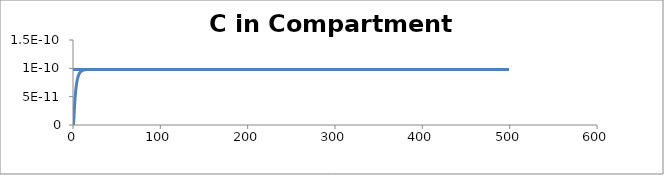
| Category | C - Sys 3 |
|---|---|
| 0.5 | 0 |
| 1.0 | 0 |
| 1.5 | 0 |
| 2.0 | 0 |
| 2.5 | 0 |
| 3.0 | 0 |
| 3.5 | 0 |
| 4.0 | 0 |
| 4.500000000000001 | 0 |
| 5.0 | 0 |
| 5.5 | 0 |
| 6.0 | 0 |
| 6.500000000000001 | 0 |
| 7.0 | 0 |
| 7.5 | 0 |
| 8.0 | 0 |
| 8.5 | 0 |
| 9.000000000000002 | 0 |
| 9.5 | 0 |
| 10.0 | 0 |
| 10.5 | 0 |
| 11.0 | 0 |
| 11.5 | 0 |
| 12.0 | 0 |
| 12.5 | 0 |
| 13.000000000000002 | 0 |
| 13.5 | 0 |
| 14.0 | 0 |
| 14.5 | 0 |
| 15.0 | 0 |
| 15.5 | 0 |
| 16.0 | 0 |
| 16.5 | 0 |
| 17.0 | 0 |
| 17.5 | 0 |
| 18.000000000000004 | 0 |
| 18.5 | 0 |
| 19.0 | 0 |
| 19.5 | 0 |
| 20.0 | 0 |
| 20.5 | 0 |
| 21.0 | 0 |
| 21.5 | 0 |
| 22.0 | 0 |
| 22.5 | 0 |
| 23.0 | 0 |
| 23.5 | 0 |
| 24.0 | 0 |
| 24.5 | 0 |
| 25.0 | 0 |
| 25.500000000000004 | 0 |
| 26.000000000000004 | 0 |
| 26.5 | 0 |
| 27.0 | 0 |
| 27.5 | 0 |
| 28.0 | 0 |
| 28.5 | 0 |
| 29.0 | 0 |
| 29.500000000000004 | 0 |
| 30.0 | 0 |
| 30.5 | 0 |
| 31.0 | 0 |
| 31.5 | 0 |
| 32.0 | 0 |
| 32.5 | 0 |
| 33.0 | 0 |
| 33.5 | 0 |
| 34.0 | 0 |
| 34.5 | 0 |
| 35.0 | 0 |
| 35.50000000000001 | 0 |
| 36.00000000000001 | 0 |
| 36.5 | 0 |
| 37.0 | 0 |
| 37.5 | 0 |
| 38.0 | 0 |
| 38.5 | 0 |
| 39.0 | 0 |
| 39.5 | 0 |
| 40.0 | 0 |
| 40.5 | 0 |
| 41.0 | 0 |
| 41.5 | 0 |
| 42.0 | 0 |
| 42.5 | 0 |
| 43.0 | 0 |
| 43.50000000000001 | 0 |
| 44.0 | 0 |
| 44.5 | 0 |
| 45.0 | 0 |
| 45.5 | 0 |
| 46.0 | 0 |
| 46.5 | 0 |
| 47.0 | 0 |
| 47.5 | 0 |
| 48.0 | 0 |
| 48.5 | 0 |
| 49.0 | 0 |
| 49.5 | 0 |
| 50.0 | 0 |
| 50.5 | 0 |
| 51.00000000000001 | 0 |
| 51.50000000000001 | 0 |
| 52.00000000000001 | 0 |
| 52.5 | 0 |
| 53.0 | 0 |
| 53.5 | 0 |
| 54.0 | 0 |
| 54.5 | 0 |
| 55.0 | 0 |
| 55.5 | 0 |
| 56.0 | 0 |
| 56.5 | 0 |
| 57.0 | 0 |
| 57.5 | 0 |
| 58.0 | 0 |
| 58.5 | 0 |
| 59.00000000000001 | 0 |
| 59.50000000000001 | 0 |
| 60.0 | 0 |
| 60.5 | 0 |
| 61.0 | 0 |
| 61.5 | 0 |
| 62.0 | 0 |
| 62.5 | 0 |
| 63.0 | 0 |
| 63.5 | 0 |
| 64.0 | 0 |
| 64.5 | 0 |
| 65.0 | 0 |
| 65.5 | 0 |
| 66.0 | 0 |
| 66.5 | 0 |
| 67.0 | 0 |
| 67.5 | 0 |
| 68.0 | 0 |
| 68.5 | 0 |
| 69.0 | 0 |
| 69.5 | 0 |
| 70.0 | 0 |
| 70.5 | 0 |
| 71.00000000000001 | 0 |
| 71.50000000000001 | 0 |
| 72.00000000000001 | 0 |
| 72.5 | 0 |
| 73.0 | 0 |
| 73.5 | 0 |
| 74.0 | 0 |
| 74.5 | 0 |
| 75.0 | 0 |
| 75.5 | 0 |
| 76.0 | 0 |
| 76.5 | 0 |
| 77.0 | 0 |
| 77.5 | 0 |
| 78.0 | 0 |
| 78.5 | 0 |
| 79.0 | 0 |
| 79.5 | 0 |
| 80.0 | 0 |
| 80.5 | 0 |
| 81.0 | 0 |
| 81.5 | 0 |
| 82.0 | 0 |
| 82.5 | 0 |
| 83.0 | 0 |
| 83.5 | 0 |
| 84.0 | 0 |
| 84.5 | 0 |
| 85.0 | 0 |
| 85.5 | 0 |
| 86.0 | 0 |
| 86.50000000000001 | 0 |
| 87.00000000000001 | 0 |
| 87.50000000000001 | 0 |
| 88.0 | 0 |
| 88.5 | 0 |
| 89.0 | 0 |
| 89.5 | 0 |
| 90.0 | 0 |
| 90.5 | 0 |
| 91.0 | 0 |
| 91.5 | 0 |
| 92.0 | 0 |
| 92.5 | 0 |
| 93.0 | 0 |
| 93.5 | 0 |
| 94.0 | 0 |
| 94.5 | 0 |
| 95.0 | 0 |
| 95.5 | 0 |
| 96.0 | 0 |
| 96.5 | 0 |
| 97.0 | 0 |
| 97.5 | 0 |
| 98.0 | 0 |
| 98.5 | 0 |
| 99.0 | 0 |
| 99.5 | 0 |
| 100.0 | 0 |
| 100.5 | 0 |
| 101.0 | 0 |
| 101.5 | 0 |
| 102.00000000000001 | 0 |
| 102.50000000000001 | 0 |
| 103.00000000000001 | 0 |
| 103.50000000000001 | 0 |
| 104.00000000000001 | 0 |
| 104.5 | 0 |
| 105.0 | 0 |
| 105.5 | 0 |
| 106.0 | 0 |
| 106.5 | 0 |
| 107.0 | 0 |
| 107.5 | 0 |
| 108.0 | 0 |
| 108.5 | 0 |
| 109.0 | 0 |
| 109.5 | 0 |
| 110.0 | 0 |
| 110.5 | 0 |
| 111.0 | 0 |
| 111.5 | 0 |
| 112.0 | 0 |
| 112.5 | 0 |
| 113.0 | 0 |
| 113.5 | 0 |
| 114.0 | 0 |
| 114.5 | 0 |
| 115.0 | 0 |
| 115.5 | 0 |
| 116.0 | 0 |
| 116.5 | 0 |
| 117.0 | 0 |
| 117.50000000000001 | 0 |
| 118.00000000000001 | 0 |
| 118.50000000000001 | 0 |
| 119.00000000000001 | 0 |
| 119.50000000000001 | 0 |
| 120.0 | 0 |
| 120.5 | 0 |
| 121.0 | 0 |
| 121.5 | 0 |
| 122.0 | 0 |
| 122.5 | 0 |
| 123.0 | 0 |
| 123.5 | 0 |
| 124.0 | 0 |
| 124.5 | 0 |
| 125.0 | 0 |
| 125.5 | 0 |
| 126.0 | 0 |
| 126.5 | 0 |
| 127.0 | 0 |
| 127.5 | 0 |
| 128.0 | 0 |
| 128.5 | 0 |
| 129.0 | 0 |
| 129.5 | 0 |
| 130.0 | 0 |
| 130.5 | 0 |
| 131.0 | 0 |
| 131.5 | 0 |
| 132.0 | 0 |
| 132.5 | 0 |
| 133.0 | 0 |
| 133.5 | 0 |
| 134.0 | 0 |
| 134.5 | 0 |
| 135.0 | 0 |
| 135.5 | 0 |
| 136.0 | 0 |
| 136.5 | 0 |
| 137.0 | 0 |
| 137.5 | 0 |
| 138.0 | 0 |
| 138.5 | 0 |
| 139.0 | 0 |
| 139.5 | 0 |
| 140.0 | 0 |
| 140.5 | 0 |
| 141.0 | 0 |
| 141.50000000000003 | 0 |
| 142.00000000000003 | 0 |
| 142.50000000000003 | 0 |
| 143.00000000000003 | 0 |
| 143.50000000000003 | 0 |
| 144.00000000000003 | 0 |
| 144.5 | 0 |
| 145.0 | 0 |
| 145.5 | 0 |
| 146.0 | 0 |
| 146.5 | 0 |
| 147.0 | 0 |
| 147.5 | 0 |
| 148.0 | 0 |
| 148.5 | 0 |
| 149.0 | 0 |
| 149.5 | 0 |
| 150.0 | 0 |
| 150.5 | 0 |
| 151.0 | 0 |
| 151.5 | 0 |
| 152.0 | 0 |
| 152.5 | 0 |
| 153.0 | 0 |
| 153.5 | 0 |
| 154.0 | 0 |
| 154.5 | 0 |
| 155.0 | 0 |
| 155.5 | 0 |
| 156.0 | 0 |
| 156.5 | 0 |
| 157.0 | 0 |
| 157.5 | 0 |
| 158.0 | 0 |
| 158.5 | 0 |
| 159.0 | 0 |
| 159.5 | 0 |
| 160.0 | 0 |
| 160.5 | 0 |
| 161.0 | 0 |
| 161.5 | 0 |
| 162.0 | 0 |
| 162.5 | 0 |
| 163.0 | 0 |
| 163.5 | 0 |
| 164.0 | 0 |
| 164.5 | 0 |
| 165.0 | 0 |
| 165.5 | 0 |
| 166.0 | 0 |
| 166.5 | 0 |
| 167.0 | 0 |
| 167.5 | 0 |
| 168.0 | 0 |
| 168.5 | 0 |
| 169.0 | 0 |
| 169.5 | 0 |
| 170.0 | 0 |
| 170.5 | 0 |
| 171.0 | 0 |
| 171.5 | 0 |
| 172.0 | 0 |
| 172.50000000000003 | 0 |
| 173.00000000000003 | 0 |
| 173.50000000000003 | 0 |
| 174.00000000000003 | 0 |
| 174.50000000000003 | 0 |
| 175.00000000000003 | 0 |
| 175.50000000000003 | 0 |
| 176.0 | 0 |
| 176.5 | 0 |
| 177.0 | 0 |
| 177.5 | 0 |
| 178.0 | 0 |
| 178.5 | 0 |
| 179.0 | 0 |
| 179.5 | 0 |
| 180.0 | 0 |
| 180.5 | 0 |
| 181.0 | 0 |
| 181.5 | 0 |
| 182.0 | 0 |
| 182.5 | 0 |
| 183.0 | 0 |
| 183.5 | 0 |
| 184.0 | 0 |
| 184.5 | 0 |
| 185.0 | 0 |
| 185.5 | 0 |
| 186.0 | 0 |
| 186.5 | 0 |
| 187.0 | 0 |
| 187.5 | 0 |
| 188.0 | 0 |
| 188.5 | 0 |
| 189.0 | 0 |
| 189.5 | 0 |
| 190.0 | 0 |
| 190.5 | 0 |
| 191.0 | 0 |
| 191.5 | 0 |
| 192.0 | 0 |
| 192.5 | 0 |
| 193.0 | 0 |
| 193.5 | 0 |
| 194.0 | 0 |
| 194.5 | 0 |
| 195.0 | 0 |
| 195.5 | 0 |
| 196.0 | 0 |
| 196.5 | 0 |
| 197.0 | 0 |
| 197.5 | 0 |
| 198.0 | 0 |
| 198.5 | 0 |
| 199.0 | 0 |
| 199.5 | 0 |
| 200.0 | 0 |
| 200.5 | 0 |
| 201.0 | 0 |
| 201.5 | 0 |
| 202.0 | 0 |
| 202.5 | 0 |
| 203.0 | 0 |
| 203.5 | 0 |
| 204.00000000000003 | 0 |
| 204.50000000000003 | 0 |
| 205.00000000000003 | 0 |
| 205.50000000000003 | 0 |
| 206.00000000000003 | 0 |
| 206.50000000000003 | 0 |
| 207.00000000000003 | 0 |
| 207.50000000000003 | 0 |
| 208.00000000000003 | 0 |
| 208.5 | 0 |
| 209.0 | 0 |
| 209.5 | 0 |
| 210.0 | 0 |
| 210.5 | 0 |
| 211.0 | 0 |
| 211.5 | 0 |
| 212.0 | 0 |
| 212.5 | 0 |
| 213.0 | 0 |
| 213.5 | 0 |
| 214.0 | 0 |
| 214.5 | 0 |
| 215.0 | 0 |
| 215.5 | 0 |
| 216.0 | 0 |
| 216.5 | 0 |
| 217.0 | 0 |
| 217.5 | 0 |
| 218.0 | 0 |
| 218.5 | 0 |
| 219.0 | 0 |
| 219.5 | 0 |
| 220.0 | 0 |
| 220.5 | 0 |
| 221.0 | 0 |
| 221.5 | 0 |
| 222.0 | 0 |
| 222.5 | 0 |
| 223.0 | 0 |
| 223.5 | 0 |
| 224.0 | 0 |
| 224.5 | 0 |
| 225.0 | 0 |
| 225.5 | 0 |
| 226.0 | 0 |
| 226.5 | 0 |
| 227.0 | 0 |
| 227.5 | 0 |
| 228.0 | 0 |
| 228.5 | 0 |
| 229.0 | 0 |
| 229.5 | 0 |
| 230.0 | 0 |
| 230.5 | 0 |
| 231.0 | 0 |
| 231.5 | 0 |
| 232.0 | 0 |
| 232.5 | 0 |
| 233.0 | 0 |
| 233.5 | 0 |
| 234.0 | 0 |
| 234.5 | 0 |
| 235.00000000000003 | 0 |
| 235.50000000000003 | 0 |
| 236.00000000000003 | 0 |
| 236.50000000000003 | 0 |
| 237.00000000000003 | 0 |
| 237.50000000000003 | 0 |
| 238.00000000000003 | 0 |
| 238.50000000000003 | 0 |
| 239.00000000000003 | 0 |
| 239.50000000000003 | 0 |
| 240.0 | 0 |
| 240.5 | 0 |
| 241.0 | 0 |
| 241.5 | 0 |
| 242.0 | 0 |
| 242.5 | 0 |
| 243.0 | 0 |
| 243.5 | 0 |
| 244.0 | 0 |
| 244.5 | 0 |
| 245.0 | 0 |
| 245.5 | 0 |
| 246.0 | 0 |
| 246.5 | 0 |
| 247.0 | 0 |
| 247.5 | 0 |
| 248.0 | 0 |
| 248.5 | 0 |
| 249.0 | 0 |
| 249.5 | 0 |
| 250.0 | 0 |
| 250.5 | 0 |
| 251.0 | 0 |
| 251.5 | 0 |
| 252.0 | 0 |
| 252.5 | 0 |
| 253.0 | 0 |
| 253.5 | 0 |
| 254.0 | 0 |
| 254.5 | 0 |
| 255.0 | 0 |
| 255.5 | 0 |
| 256.0 | 0 |
| 256.5 | 0 |
| 257.0 | 0 |
| 257.5 | 0 |
| 258.0 | 0 |
| 258.5 | 0 |
| 259.0 | 0 |
| 259.5 | 0 |
| 260.0 | 0 |
| 260.5 | 0 |
| 261.0 | 0 |
| 261.5 | 0 |
| 262.0 | 0 |
| 262.5 | 0 |
| 263.0 | 0 |
| 263.5 | 0 |
| 264.0 | 0 |
| 264.5 | 0 |
| 265.0 | 0 |
| 265.5 | 0 |
| 266.0 | 0 |
| 266.5 | 0 |
| 267.0 | 0 |
| 267.5 | 0 |
| 268.0 | 0 |
| 268.5 | 0 |
| 269.0 | 0 |
| 269.5 | 0 |
| 270.0 | 0 |
| 270.5 | 0 |
| 271.0 | 0 |
| 271.5 | 0 |
| 272.0 | 0 |
| 272.5 | 0 |
| 273.0 | 0 |
| 273.5 | 0 |
| 274.0 | 0 |
| 274.5 | 0 |
| 275.0 | 0 |
| 275.5 | 0 |
| 276.0 | 0 |
| 276.5 | 0 |
| 277.0 | 0 |
| 277.5 | 0 |
| 278.0 | 0 |
| 278.5 | 0 |
| 279.0 | 0 |
| 279.5 | 0 |
| 280.0 | 0 |
| 280.5 | 0 |
| 281.0 | 0 |
| 281.5 | 0 |
| 282.0 | 0 |
| 282.50000000000006 | 0 |
| 283.00000000000006 | 0 |
| 283.50000000000006 | 0 |
| 284.00000000000006 | 0 |
| 284.50000000000006 | 0 |
| 285.00000000000006 | 0 |
| 285.50000000000006 | 0 |
| 286.00000000000006 | 0 |
| 286.50000000000006 | 0 |
| 287.00000000000006 | 0 |
| 287.50000000000006 | 0 |
| 288.00000000000006 | 0 |
| 288.5 | 0 |
| 289.0 | 0 |
| 289.5 | 0 |
| 290.0 | 0 |
| 290.5 | 0 |
| 291.0 | 0 |
| 291.5 | 0 |
| 292.0 | 0 |
| 292.5 | 0 |
| 293.0 | 0 |
| 293.5 | 0 |
| 294.0 | 0 |
| 294.5 | 0 |
| 295.0 | 0 |
| 295.5 | 0 |
| 296.0 | 0 |
| 296.5 | 0 |
| 297.0 | 0 |
| 297.5 | 0 |
| 298.0 | 0 |
| 298.5 | 0 |
| 299.0 | 0 |
| 299.5 | 0 |
| 300.0 | 0 |
| 300.5 | 0 |
| 301.0 | 0 |
| 301.5 | 0 |
| 302.0 | 0 |
| 302.5 | 0 |
| 303.0 | 0 |
| 303.5 | 0 |
| 304.0 | 0 |
| 304.5 | 0 |
| 305.0 | 0 |
| 305.5 | 0 |
| 306.0 | 0 |
| 306.5 | 0 |
| 307.0 | 0 |
| 307.5 | 0 |
| 308.0 | 0 |
| 308.5 | 0 |
| 309.0 | 0 |
| 309.5 | 0 |
| 310.0 | 0 |
| 310.5 | 0 |
| 311.0 | 0 |
| 311.5 | 0 |
| 312.0 | 0 |
| 312.5 | 0 |
| 313.0 | 0 |
| 313.5 | 0 |
| 314.0 | 0 |
| 314.5 | 0 |
| 315.0 | 0 |
| 315.5 | 0 |
| 316.0 | 0 |
| 316.5 | 0 |
| 317.0 | 0 |
| 317.5 | 0 |
| 318.0 | 0 |
| 318.5 | 0 |
| 319.0 | 0 |
| 319.5 | 0 |
| 320.0 | 0 |
| 320.5 | 0 |
| 321.0 | 0 |
| 321.5 | 0 |
| 322.0 | 0 |
| 322.5 | 0 |
| 323.0 | 0 |
| 323.5 | 0 |
| 324.0 | 0 |
| 324.5 | 0 |
| 325.0 | 0 |
| 325.5 | 0 |
| 326.0 | 0 |
| 326.5 | 0 |
| 327.0 | 0 |
| 327.5 | 0 |
| 328.0 | 0 |
| 328.5 | 0 |
| 329.0 | 0 |
| 329.5 | 0 |
| 330.0 | 0 |
| 330.5 | 0 |
| 331.0 | 0 |
| 331.5 | 0 |
| 332.0 | 0 |
| 332.5 | 0 |
| 333.0 | 0 |
| 333.5 | 0 |
| 334.0 | 0 |
| 334.5 | 0 |
| 335.0 | 0 |
| 335.5 | 0 |
| 336.0 | 0 |
| 336.5 | 0 |
| 337.0 | 0 |
| 337.5 | 0 |
| 338.0 | 0 |
| 338.5 | 0 |
| 339.0 | 0 |
| 339.5 | 0 |
| 340.0 | 0 |
| 340.5 | 0 |
| 341.0 | 0 |
| 341.5 | 0 |
| 342.0 | 0 |
| 342.5 | 0 |
| 343.0 | 0 |
| 343.5 | 0 |
| 344.0 | 0 |
| 344.5 | 0 |
| 345.00000000000006 | 0 |
| 345.50000000000006 | 0 |
| 346.00000000000006 | 0 |
| 346.50000000000006 | 0 |
| 347.00000000000006 | 0 |
| 347.50000000000006 | 0 |
| 348.00000000000006 | 0 |
| 348.50000000000006 | 0 |
| 349.00000000000006 | 0 |
| 349.50000000000006 | 0 |
| 350.00000000000006 | 0 |
| 350.50000000000006 | 0 |
| 351.00000000000006 | 0 |
| 351.50000000000006 | 0 |
| 352.0 | 0 |
| 352.5 | 0 |
| 353.0 | 0 |
| 353.5 | 0 |
| 354.0 | 0 |
| 354.5 | 0 |
| 355.0 | 0 |
| 355.5 | 0 |
| 356.0 | 0 |
| 356.5 | 0 |
| 357.0 | 0 |
| 357.5 | 0 |
| 358.0 | 0 |
| 358.5 | 0 |
| 359.0 | 0 |
| 359.5 | 0 |
| 360.0 | 0 |
| 360.5 | 0 |
| 361.0 | 0 |
| 361.5 | 0 |
| 362.0 | 0 |
| 362.5 | 0 |
| 363.0 | 0 |
| 363.5 | 0 |
| 364.0 | 0 |
| 364.5 | 0 |
| 365.0 | 0 |
| 365.5 | 0 |
| 366.0 | 0 |
| 366.5 | 0 |
| 367.0 | 0 |
| 367.5 | 0 |
| 368.0 | 0 |
| 368.5 | 0 |
| 369.0 | 0 |
| 369.5 | 0 |
| 370.0 | 0 |
| 370.5 | 0 |
| 371.0 | 0 |
| 371.5 | 0 |
| 372.0 | 0 |
| 372.5 | 0 |
| 373.0 | 0 |
| 373.5 | 0 |
| 374.0 | 0 |
| 374.5 | 0 |
| 375.0 | 0 |
| 375.5 | 0 |
| 376.0 | 0 |
| 376.5 | 0 |
| 377.0 | 0 |
| 377.5 | 0 |
| 378.0 | 0 |
| 378.5 | 0 |
| 379.0 | 0 |
| 379.5 | 0 |
| 380.0 | 0 |
| 380.5 | 0 |
| 381.0 | 0 |
| 381.5 | 0 |
| 382.0 | 0 |
| 382.5 | 0 |
| 383.0 | 0 |
| 383.5 | 0 |
| 384.0 | 0 |
| 384.5 | 0 |
| 385.0 | 0 |
| 385.5 | 0 |
| 386.0 | 0 |
| 386.5 | 0 |
| 387.0 | 0 |
| 387.5 | 0 |
| 388.0 | 0 |
| 388.5 | 0 |
| 389.0 | 0 |
| 389.5 | 0 |
| 390.0 | 0 |
| 390.5 | 0 |
| 391.0 | 0 |
| 391.5 | 0 |
| 392.0 | 0 |
| 392.5 | 0 |
| 393.0 | 0 |
| 393.5 | 0 |
| 394.0 | 0 |
| 394.5 | 0 |
| 395.0 | 0 |
| 395.5 | 0 |
| 396.0 | 0 |
| 396.5 | 0 |
| 397.0 | 0 |
| 397.5 | 0 |
| 398.0 | 0 |
| 398.5 | 0 |
| 399.0 | 0 |
| 399.5 | 0 |
| 400.0 | 0 |
| 400.5 | 0 |
| 401.0 | 0 |
| 401.5 | 0 |
| 402.0 | 0 |
| 402.5 | 0 |
| 403.0 | 0 |
| 403.5 | 0 |
| 404.0 | 0 |
| 404.5 | 0 |
| 405.0 | 0 |
| 405.5 | 0 |
| 406.0 | 0 |
| 406.5 | 0 |
| 407.0 | 0 |
| 407.50000000000006 | 0 |
| 408.00000000000006 | 0 |
| 408.50000000000006 | 0 |
| 409.00000000000006 | 0 |
| 409.50000000000006 | 0 |
| 410.00000000000006 | 0 |
| 410.50000000000006 | 0 |
| 411.00000000000006 | 0 |
| 411.50000000000006 | 0 |
| 412.00000000000006 | 0 |
| 412.50000000000006 | 0 |
| 413.00000000000006 | 0 |
| 413.50000000000006 | 0 |
| 414.00000000000006 | 0 |
| 414.50000000000006 | 0 |
| 415.00000000000006 | 0 |
| 415.50000000000006 | 0 |
| 416.00000000000006 | 0 |
| 416.5 | 0 |
| 417.0 | 0 |
| 417.5 | 0 |
| 418.0 | 0 |
| 418.5 | 0 |
| 419.0 | 0 |
| 419.5 | 0 |
| 420.0 | 0 |
| 420.5 | 0 |
| 421.0 | 0 |
| 421.5 | 0 |
| 422.0 | 0 |
| 422.5 | 0 |
| 423.0 | 0 |
| 423.5 | 0 |
| 424.0 | 0 |
| 424.5 | 0 |
| 425.0 | 0 |
| 425.5 | 0 |
| 426.0 | 0 |
| 426.5 | 0 |
| 427.0 | 0 |
| 427.5 | 0 |
| 428.0 | 0 |
| 428.5 | 0 |
| 429.0 | 0 |
| 429.5 | 0 |
| 430.0 | 0 |
| 430.5 | 0 |
| 431.0 | 0 |
| 431.5 | 0 |
| 432.0 | 0 |
| 432.5 | 0 |
| 433.0 | 0 |
| 433.5 | 0 |
| 434.0 | 0 |
| 434.5 | 0 |
| 435.0 | 0 |
| 435.5 | 0 |
| 436.0 | 0 |
| 436.5 | 0 |
| 437.0 | 0 |
| 437.5 | 0 |
| 438.0 | 0 |
| 438.5 | 0 |
| 439.0 | 0 |
| 439.5 | 0 |
| 440.0 | 0 |
| 440.5 | 0 |
| 441.0 | 0 |
| 441.5 | 0 |
| 442.0 | 0 |
| 442.5 | 0 |
| 443.0 | 0 |
| 443.5 | 0 |
| 444.0 | 0 |
| 444.5 | 0 |
| 445.0 | 0 |
| 445.5 | 0 |
| 446.0 | 0 |
| 446.5 | 0 |
| 447.0 | 0 |
| 447.5 | 0 |
| 448.0 | 0 |
| 448.5 | 0 |
| 449.0 | 0 |
| 449.5 | 0 |
| 450.0 | 0 |
| 450.5 | 0 |
| 451.0 | 0 |
| 451.5 | 0 |
| 452.0 | 0 |
| 452.5 | 0 |
| 453.0 | 0 |
| 453.5 | 0 |
| 454.0 | 0 |
| 454.5 | 0 |
| 455.0 | 0 |
| 455.5 | 0 |
| 456.0 | 0 |
| 456.5 | 0 |
| 457.0 | 0 |
| 457.5 | 0 |
| 458.0 | 0 |
| 458.5 | 0 |
| 459.0 | 0 |
| 459.5 | 0 |
| 460.0 | 0 |
| 460.5 | 0 |
| 461.0 | 0 |
| 461.5 | 0 |
| 462.0 | 0 |
| 462.5 | 0 |
| 463.0 | 0 |
| 463.5 | 0 |
| 464.0 | 0 |
| 464.5 | 0 |
| 465.0 | 0 |
| 465.5 | 0 |
| 466.0 | 0 |
| 466.5 | 0 |
| 467.0 | 0 |
| 467.5 | 0 |
| 468.0 | 0 |
| 468.5 | 0 |
| 469.0 | 0 |
| 469.5 | 0 |
| 470.00000000000006 | 0 |
| 470.50000000000006 | 0 |
| 471.00000000000006 | 0 |
| 471.50000000000006 | 0 |
| 472.00000000000006 | 0 |
| 472.50000000000006 | 0 |
| 473.00000000000006 | 0 |
| 473.50000000000006 | 0 |
| 474.00000000000006 | 0 |
| 474.50000000000006 | 0 |
| 475.00000000000006 | 0 |
| 475.50000000000006 | 0 |
| 476.00000000000006 | 0 |
| 476.50000000000006 | 0 |
| 477.00000000000006 | 0 |
| 477.50000000000006 | 0 |
| 478.00000000000006 | 0 |
| 478.50000000000006 | 0 |
| 479.00000000000006 | 0 |
| 479.50000000000006 | 0 |
| 480.0 | 0 |
| 480.5 | 0 |
| 481.0 | 0 |
| 481.5 | 0 |
| 482.0 | 0 |
| 482.5 | 0 |
| 483.0 | 0 |
| 483.5 | 0 |
| 484.0 | 0 |
| 484.5 | 0 |
| 485.0 | 0 |
| 485.5 | 0 |
| 486.0 | 0 |
| 486.5 | 0 |
| 487.0 | 0 |
| 487.5 | 0 |
| 488.0 | 0 |
| 488.5 | 0 |
| 489.0 | 0 |
| 489.5 | 0 |
| 490.0 | 0 |
| 490.5 | 0 |
| 491.0 | 0 |
| 491.5 | 0 |
| 492.0 | 0 |
| 492.5 | 0 |
| 493.0 | 0 |
| 493.5 | 0 |
| 494.0 | 0 |
| 494.5 | 0 |
| 495.0 | 0 |
| 495.5 | 0 |
| 496.0 | 0 |
| 496.5 | 0 |
| 497.0 | 0 |
| 497.5 | 0 |
| 498.0 | 0 |
| 498.5 | 0 |
| 499.0 | 0 |
| 499.5 | 0 |
| 500.0 | 0 |